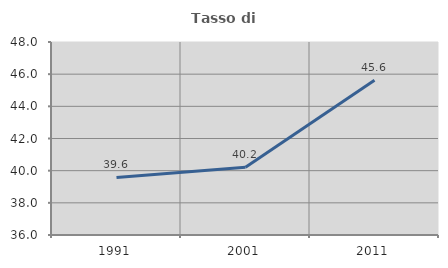
| Category | Tasso di occupazione   |
|---|---|
| 1991.0 | 39.578 |
| 2001.0 | 40.207 |
| 2011.0 | 45.616 |